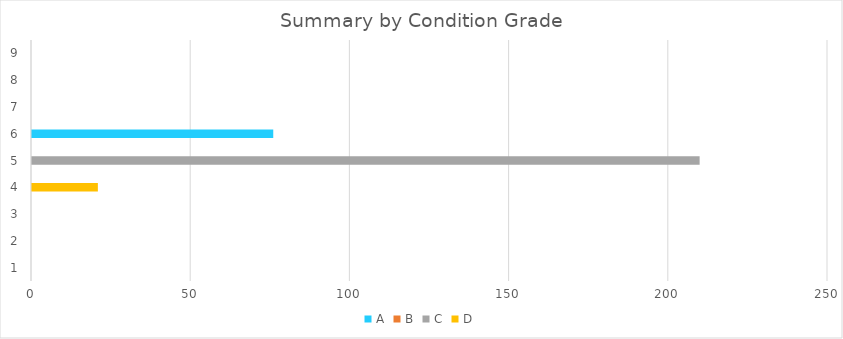
| Category | A | B | C | D |
|---|---|---|---|---|
| 0 | 0 | 0 | 0 | 0 |
| 1 | 0 | 0 | 0 | 0 |
| 2 | 0 | 0 | 0 | 0 |
| 3 | 0 | 0 | 0 | 21 |
| 4 | 0 | 0 | 210 | 0 |
| 5 | 76.083 | 0 | 0 | 0 |
| 6 | 0 | 0 | 0 | 0 |
| 7 | 0 | 0 | 0 | 0 |
| 8 | 0 | 0 | 0 | 0 |